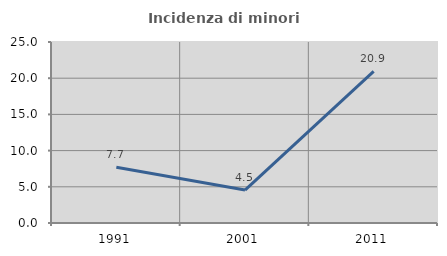
| Category | Incidenza di minori stranieri |
|---|---|
| 1991.0 | 7.692 |
| 2001.0 | 4.545 |
| 2011.0 | 20.93 |